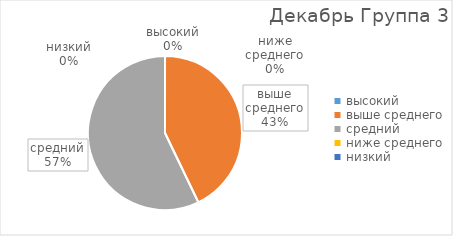
| Category | Series 0 |
|---|---|
| высокий | 0 |
| выше среднего | 3 |
| средний | 4 |
| ниже среднего | 0 |
| низкий | 0 |